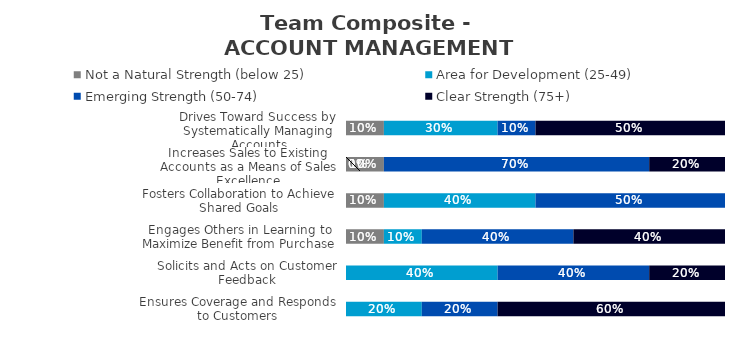
| Category | Not a Natural Strength (below 25) | Area for Development (25-49) | Emerging Strength (50-74) | Clear Strength (75+) |
|---|---|---|---|---|
| Drives Toward Success by Systematically Managing Accounts | 0.1 | 0.3 | 0.1 | 0.5 |
| Increases Sales to Existing Accounts as a Means of Sales Excellence | 0.1 | 0 | 0.7 | 0.2 |
| Fosters Collaboration to Achieve Shared Goals | 0.1 | 0.4 | 0.5 | 0 |
| Engages Others in Learning to Maximize Benefit from Purchase | 0.1 | 0.1 | 0.4 | 0.4 |
| Solicits and Acts on Customer Feedback | 0 | 0.4 | 0.4 | 0.2 |
| Ensures Coverage and Responds to Customers | 0 | 0.2 | 0.2 | 0.6 |